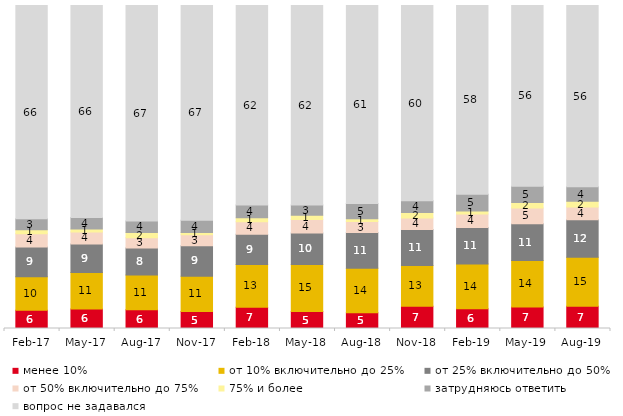
| Category | менее 10% | от 10% включительно до 25% | от 25% включительно до 50% | от 50% включительно до 75% | 75% и более | затрудняюсь ответить | вопрос не задавался |
|---|---|---|---|---|---|---|---|
| 2017-02-01 | 5.65 | 10.4 | 9.15 | 4.1 | 1.3 | 3.35 | 66.05 |
| 2017-05-01 | 6 | 11.3 | 8.85 | 3.75 | 0.9 | 3.55 | 65.65 |
| 2017-08-01 | 5.8 | 10.75 | 8.4 | 3.15 | 1.65 | 3.55 | 66.7 |
| 2017-11-01 | 5.25 | 10.95 | 9.4 | 3.45 | 0.7 | 3.75 | 66.5 |
| 2018-02-01 | 6.6 | 13.25 | 9.35 | 3.85 | 1.25 | 3.9 | 61.8 |
| 2018-05-01 | 5.25 | 14.6 | 9.7 | 4.2 | 1.35 | 3.1 | 61.8 |
| 2018-08-01 | 4.9 | 13.75 | 11.05 | 3.4 | 0.9 | 4.7 | 61.3 |
| 2018-11-01 | 6.886 | 12.625 | 11.128 | 3.543 | 1.697 | 3.643 | 60.479 |
| 2019-02-01 | 6.1 | 13.85 | 11.3 | 4.2 | 0.95 | 5.15 | 58.45 |
| 2019-05-01 | 6.686 | 14.364 | 11.392 | 4.854 | 1.734 | 5.002 | 55.968 |
| 2019-08-01 | 6.893 | 15.135 | 11.638 | 3.946 | 1.748 | 4.496 | 56.144 |